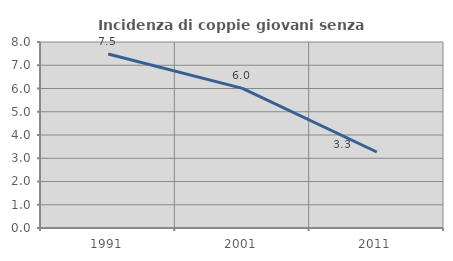
| Category | Incidenza di coppie giovani senza figli |
|---|---|
| 1991.0 | 7.483 |
| 2001.0 | 6.004 |
| 2011.0 | 3.269 |